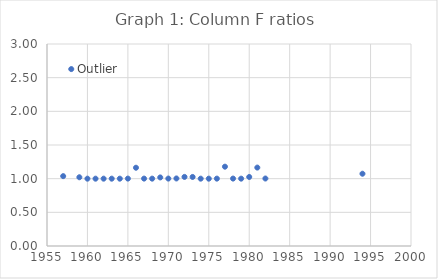
| Category | Series 0 |
|---|---|
| 1957.0 | 1.038 |
| 1958.0 | 2.628 |
| 1959.0 | 1.021 |
| 1960.0 | 1 |
| 1961.0 | 1 |
| 1962.0 | 1 |
| 1963.0 | 1 |
| 1964.0 | 1 |
| 1965.0 | 1.001 |
| 1966.0 | 1.162 |
| 1967.0 | 1.001 |
| 1968.0 | 1 |
| 1969.0 | 1.018 |
| 1970.0 | 1.001 |
| 1971.0 | 1.003 |
| 1972.0 | 1.026 |
| 1973.0 | 1.025 |
| 1974.0 | 1 |
| 1975.0 | 1 |
| 1976.0 | 1.001 |
| 1977.0 | 1.178 |
| 1978.0 | 1.001 |
| 1979.0 | 1 |
| 1980.0 | 1.025 |
| 1981.0 | 1.165 |
| 1982.0 | 1.002 |
| 1994.0 | 1.073 |